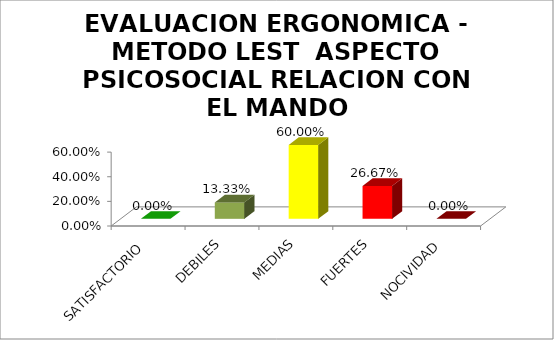
| Category | EVALUACION ERGONOMICA - METODO LEST  |
|---|---|
| SATISFACTORIO | 0 |
| DEBILES | 0.133 |
| MEDIAS | 0.6 |
| FUERTES | 0.267 |
| NOCIVIDAD | 0 |